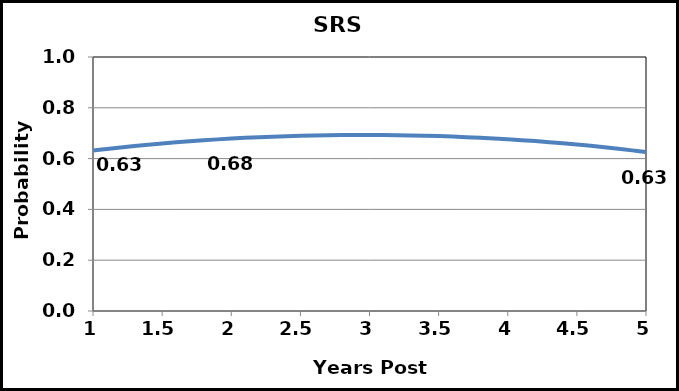
| Category | SRS prob |
|---|---|
| 1.0 | 0.631 |
| 1.1 | 0.638 |
| 1.2 | 0.644 |
| 1.3 | 0.649 |
| 1.4 | 0.655 |
| 1.5 | 0.66 |
| 1.6 | 0.664 |
| 1.7 | 0.668 |
| 1.8 | 0.672 |
| 1.9 | 0.676 |
| 2.0 | 0.679 |
| 2.1 | 0.682 |
| 2.2 | 0.684 |
| 2.3 | 0.686 |
| 2.4 | 0.688 |
| 2.5 | 0.69 |
| 2.6 | 0.691 |
| 2.7 | 0.692 |
| 2.8 | 0.693 |
| 2.9 | 0.693 |
| 3.0 | 0.693 |
| 3.1 | 0.693 |
| 3.2 | 0.692 |
| 3.3 | 0.691 |
| 3.4 | 0.69 |
| 3.5 | 0.689 |
| 3.6 | 0.687 |
| 3.7 | 0.685 |
| 3.8 | 0.682 |
| 3.9 | 0.679 |
| 4.0 | 0.676 |
| 4.1 | 0.673 |
| 4.2 | 0.669 |
| 4.3 | 0.665 |
| 4.4 | 0.66 |
| 4.5 | 0.655 |
| 4.6 | 0.65 |
| 4.7 | 0.645 |
| 4.8 | 0.639 |
| 4.9 | 0.632 |
| 5.0 | 0.626 |